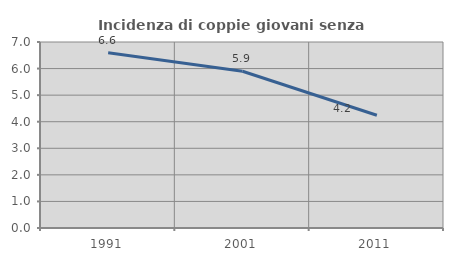
| Category | Incidenza di coppie giovani senza figli |
|---|---|
| 1991.0 | 6.597 |
| 2001.0 | 5.899 |
| 2011.0 | 4.244 |